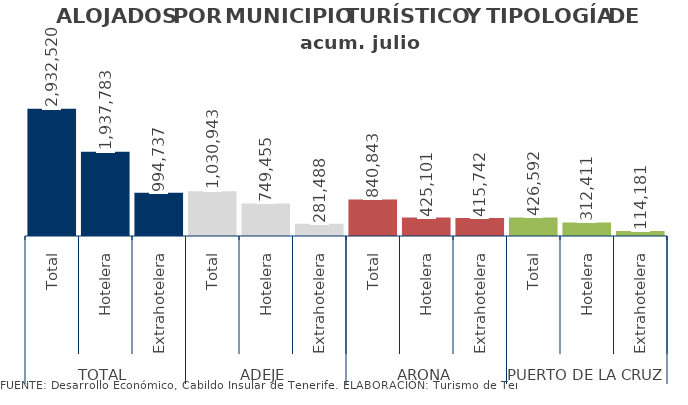
| Category | acum. julio 2014 |
|---|---|
| 0 | 2932520 |
| 1 | 1937783 |
| 2 | 994737 |
| 3 | 1030943 |
| 4 | 749455 |
| 5 | 281488 |
| 6 | 840843 |
| 7 | 425101 |
| 8 | 415742 |
| 9 | 426592 |
| 10 | 312411 |
| 11 | 114181 |